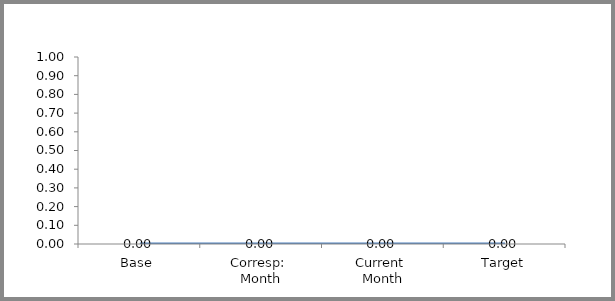
| Category | Series 0 |
|---|---|
| Base | 0 |
| Corresp: 
Month | 0 |
| Current 
Month | 0 |
| Target | 0 |